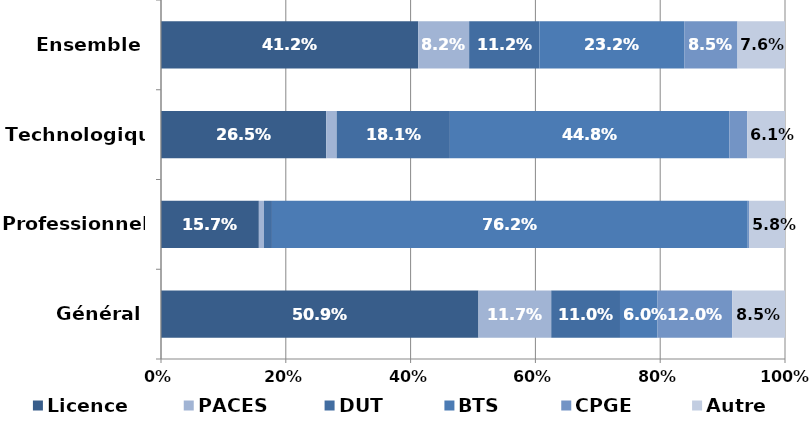
| Category | Licence | PACES | DUT | BTS | CPGE | Autre |
|---|---|---|---|---|---|---|
| Général | 0.509 | 0.117 | 0.11 | 0.06 | 0.12 | 0.085 |
| Professionnel | 0.157 | 0.008 | 0.013 | 0.762 | 0.002 | 0.058 |
| Technologique | 0.265 | 0.017 | 0.181 | 0.448 | 0.029 | 0.061 |
| Ensemble | 0.412 | 0.082 | 0.112 | 0.232 | 0.085 | 0.076 |